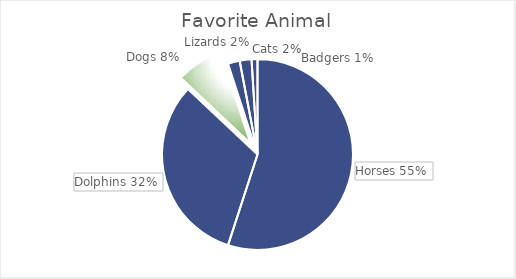
| Category | Votes |
|---|---|
| Horses | 0.55 |
| Dolphins | 0.32 |
| Dogs | 0.08 |
| Lizards | 0.02 |
| Cats | 0.02 |
| Badgers | 0.01 |